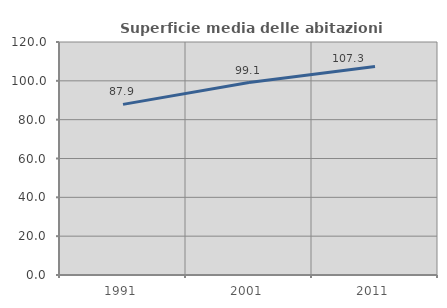
| Category | Superficie media delle abitazioni occupate |
|---|---|
| 1991.0 | 87.865 |
| 2001.0 | 99.137 |
| 2011.0 | 107.328 |